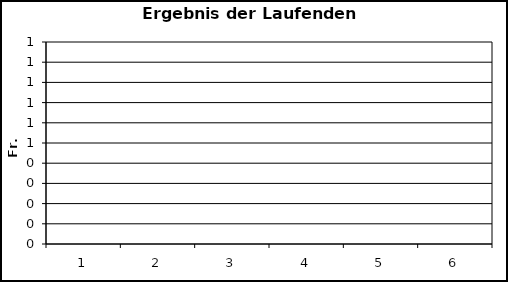
| Category | Ergebnis der LR |
|---|---|
| 1.0 | 0 |
| 2.0 | 0 |
| 3.0 | 0 |
| 4.0 | 0 |
| 5.0 | 0 |
| 6.0 | 0 |